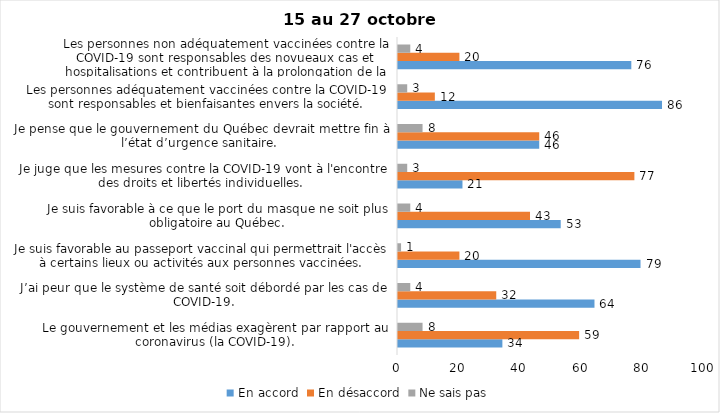
| Category | En accord | En désaccord | Ne sais pas |
|---|---|---|---|
| Le gouvernement et les médias exagèrent par rapport au coronavirus (la COVID-19). | 34 | 59 | 8 |
| J’ai peur que le système de santé soit débordé par les cas de COVID-19. | 64 | 32 | 4 |
| Je suis favorable au passeport vaccinal qui permettrait l'accès à certains lieux ou activités aux personnes vaccinées. | 79 | 20 | 1 |
| Je suis favorable à ce que le port du masque ne soit plus obligatoire au Québec. | 53 | 43 | 4 |
| Je juge que les mesures contre la COVID-19 vont à l'encontre des droits et libertés individuelles.  | 21 | 77 | 3 |
| Je pense que le gouvernement du Québec devrait mettre fin à l’état d’urgence sanitaire.  | 46 | 46 | 8 |
| Les personnes adéquatement vaccinées contre la COVID-19 sont responsables et bienfaisantes envers la société. | 86 | 12 | 3 |
| Les personnes non adéquatement vaccinées contre la COVID-19 sont responsables des novueaux cas et hospitalisations et contribuent à la prolongation de la pandémie au Québec. | 76 | 20 | 4 |